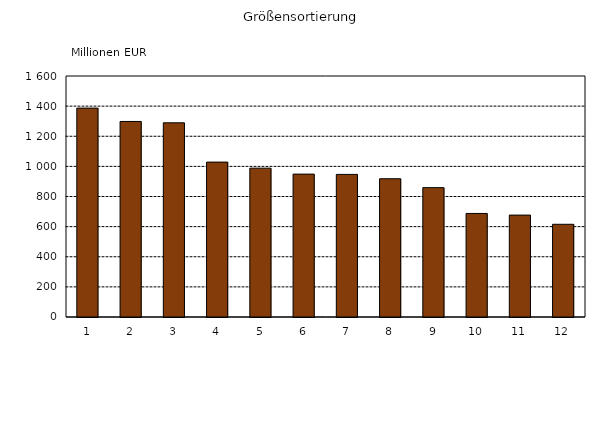
| Category | Series 0 |
|---|---|
| 1 | 1386.85 |
| 2 | 1298.138 |
| 3 | 1289.297 |
| 4 | 1028.355 |
| 5 | 988.158 |
| 6 | 948.576 |
| 7 | 946.672 |
| 8 | 917.882 |
| 9 | 858.908 |
| 10 | 687.54 |
| 11 | 676.53 |
| 12 | 615.471 |